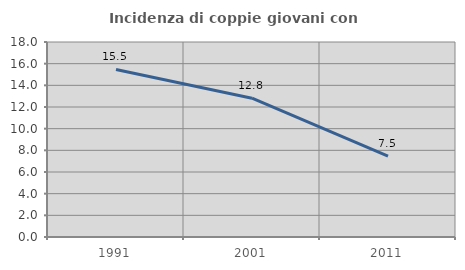
| Category | Incidenza di coppie giovani con figli |
|---|---|
| 1991.0 | 15.468 |
| 2001.0 | 12.81 |
| 2011.0 | 7.465 |